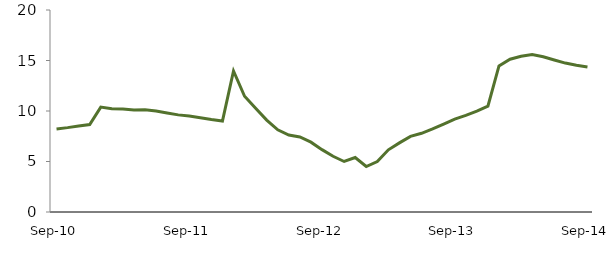
| Category | Series 0 |
|---|---|
| Sep-10 | 8.226 |
|  | 8.355 |
|  | 8.51 |
|  | 8.658 |
|  | 10.387 |
|  | 10.226 |
|  | 10.187 |
|  | 10.098 |
|  | 10.112 |
|  | 9.997 |
|  | 9.799 |
|  | 9.617 |
| Sep-11 | 9.496 |
|  | 9.328 |
|  | 9.151 |
|  | 9.003 |
|  | 13.958 |
|  | 11.462 |
|  | 10.275 |
|  | 9.102 |
|  | 8.135 |
|  | 7.62 |
|  | 7.427 |
|  | 6.915 |
| Sep-12 | 6.173 |
|  | 5.517 |
|  | 5.001 |
|  | 5.391 |
|  | 4.502 |
|  | 4.988 |
|  | 6.155 |
|  | 6.846 |
|  | 7.49 |
|  | 7.793 |
|  | 8.223 |
|  | 8.703 |
| Sep-13 | 9.197 |
|  | 9.564 |
|  | 9.978 |
|  | 10.478 |
|  | 14.467 |
|  | 15.129 |
|  | 15.422 |
|  | 15.593 |
|  | 15.372 |
|  | 15.054 |
|  | 14.745 |
|  | 14.529 |
| Sep-14 | 14.365 |